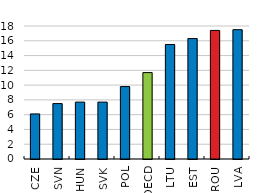
| Category | Poverty rate (lhs) |
|---|---|
| CZE | 6.1 |
| SVN | 7.5 |
| HUN | 7.7 |
| SVK | 7.7 |
| POL | 9.8 |
| OECD | 11.695 |
| LTU | 15.5 |
| EST | 16.3 |
| ROU | 17.4 |
| LVA | 17.5 |